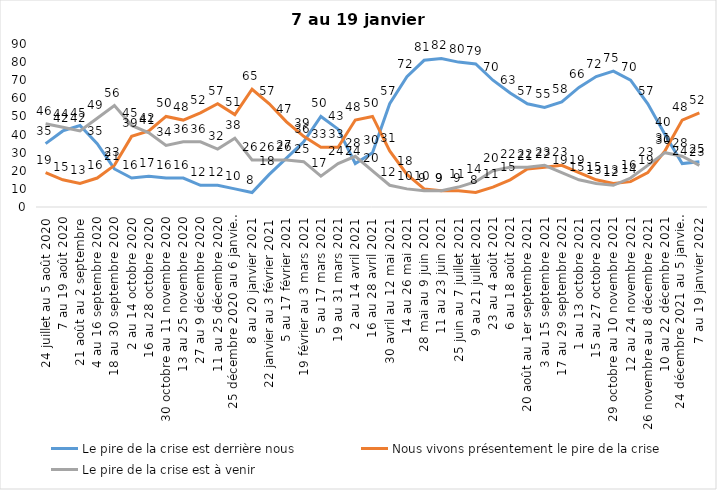
| Category | Le pire de la crise est derrière nous | Nous vivons présentement le pire de la crise | Le pire de la crise est à venir |
|---|---|---|---|
| 24 juillet au 5 août 2020 | 35 | 19 | 46 |
| 7 au 19 août 2020 | 42 | 15 | 44 |
| 21 août au 2 septembre | 45 | 13 | 42 |
| 4 au 16 septembre 2020 | 35 | 16 | 49 |
| 18 au 30 septembre 2020 | 21 | 23 | 56 |
| 2 au 14 octobre 2020 | 16 | 39 | 45 |
| 16 au 28 octobre 2020 | 17 | 42 | 41 |
| 30 octobre au 11 novembre 2020 | 16 | 50 | 34 |
| 13 au 25 novembre 2020 | 16 | 48 | 36 |
| 27 au 9 décembre 2020 | 12 | 52 | 36 |
| 11 au 25 décembre 2020 | 12 | 57 | 32 |
| 25 décembre 2020 au 6 janvier 2021 | 10 | 51 | 38 |
| 8 au 20 janvier 2021 | 8 | 65 | 26 |
| 22 janvier au 3 février 2021 | 18 | 57 | 26 |
| 5 au 17 février 2021 | 27 | 47 | 26 |
| 19 février au 3 mars 2021 | 36 | 39 | 25 |
| 5 au 17 mars 2021 | 50 | 33 | 17 |
| 19 au 31 mars 2021 | 43 | 33 | 24 |
| 2 au 14 avril 2021 | 24 | 48 | 28 |
| 16 au 28 avril 2021 | 30 | 50 | 20 |
| 30 avril au 12 mai 2021 | 57 | 31 | 12 |
| 14 au 26 mai 2021 | 72 | 18 | 10 |
| 28 mai au 9 juin 2021 | 81 | 10 | 9 |
| 11 au 23 juin 2021 | 82 | 9 | 9 |
| 25 juin au 7 juillet 2021 | 80 | 9 | 11 |
| 9 au 21 juillet 2021 | 79 | 8 | 14 |
| 23 au 4 août 2021 | 70 | 11 | 20 |
| 6 au 18 août 2021 | 63 | 15 | 22 |
| 20 août au 1er septembre 2021 | 57 | 21 | 22 |
| 3 au 15 septembre 2021 | 55 | 22 | 23 |
| 17 au 29 septembre 2021 | 58 | 23 | 19 |
| 1 au 13 octobre 2021 | 66 | 19 | 15 |
| 15 au 27 octobre 2021 | 72 | 15 | 13 |
| 29 octobre au 10 novembre 2021 | 75 | 13 | 12 |
| 12 au 24 novembre 2021 | 70 | 14 | 16 |
| 26 novembre au 8 décembre 2021 | 57 | 19 | 23 |
| 10 au 22 décembre 2021 | 40 | 31 | 30 |
| 24 décembre 2021 au 5 janvier 2022 | 24 | 48 | 28 |
| 7 au 19 janvier 2022 | 25 | 52 | 23 |